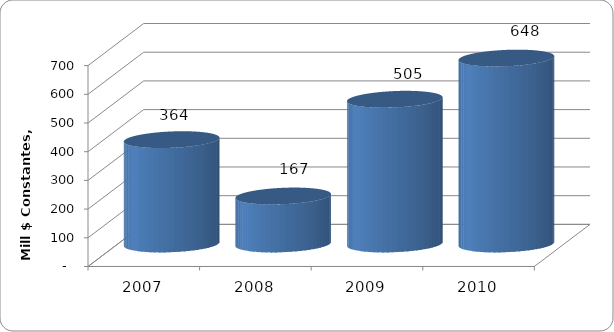
| Category | SALDO DE DEUDA |
|---|---|
| 2007 | 363.708 |
| 2008 | 167.321 |
| 2009 | 504.501 |
| 2010 | 648 |